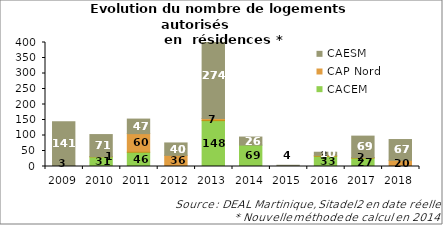
| Category | CACEM | CAP Nord | CAESM |
|---|---|---|---|
| 2009 | 0 | 3 | 141 |
| 2010 | 31 | 1 | 71 |
| 2011 | 46 | 60 | 47 |
| 2012 | 0 | 36 | 40 |
| 2013 | 148 | 7 | 274 |
| 2014 | 69 | 0 | 26 |
| 2015 | 0 | 0 | 4 |
| 2016 | 33 | 3 | 10 |
| 2017 | 27 | 2 | 69 |
| 2018 | 0 | 20 | 67 |